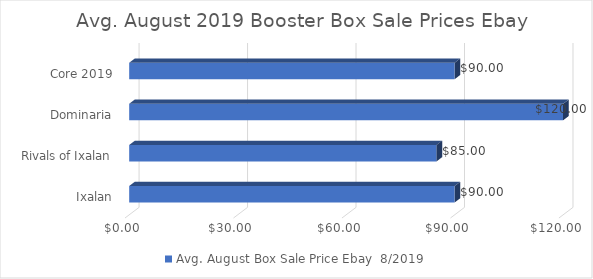
| Category | Avg. August Box Sale Price Ebay  8/2019 |
|---|---|
| Ixalan | 90 |
| Rivals of Ixalan | 85 |
| Dominaria | 120 |
| Core 2019 | 90 |